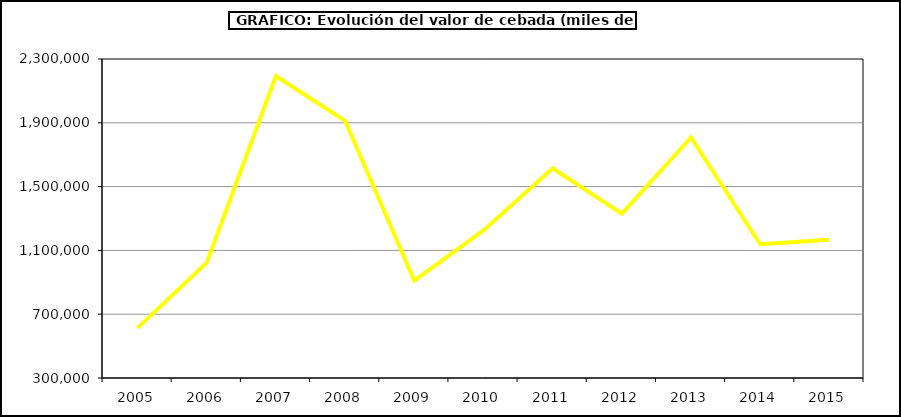
| Category | Valor |
|---|---|
| 2005.0 | 614340.635 |
| 2006.0 | 1022744.097 |
| 2007.0 | 2193160.568 |
| 2008.0 | 1912466.563 |
| 2009.0 | 909802.97 |
| 2010.0 | 1225605.118 |
| 2011.0 | 1614321.82 |
| 2012.0 | 1330052.285 |
| 2013.0 | 1807903.139 |
| 2014.0 | 1138276.107 |
| 2015.0 | 1166688 |